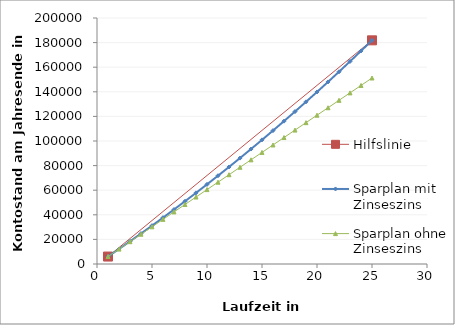
| Category | Hilfslinie |
|---|---|
| 1.0 | 6048.75 |
| 25.0 | 181843.714 |